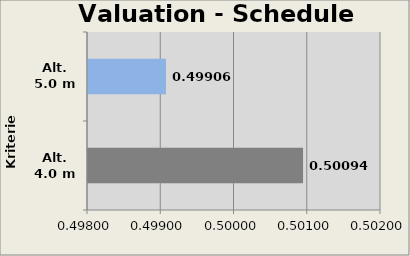
| Category | Valuation Schedule Module  |
|---|---|
| Alt. 4.0 m | 0.501 |
| Alt. 5.0 m | 0.499 |